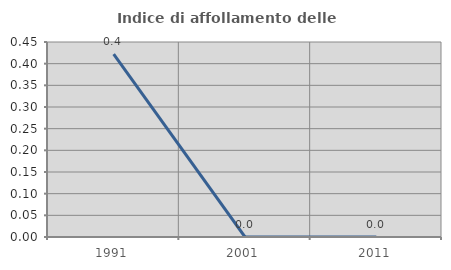
| Category | Indice di affollamento delle abitazioni  |
|---|---|
| 1991.0 | 0.422 |
| 2001.0 | 0 |
| 2011.0 | 0 |